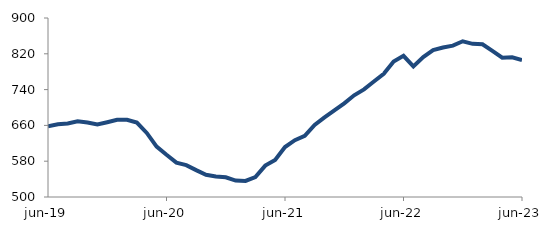
| Category | Series 0 |
|---|---|
| 2019-06-01 | 657.952 |
| 2019-07-01 | 662.49 |
| 2019-08-01 | 664.104 |
| 2019-09-01 | 669.196 |
| 2019-10-01 | 666.5 |
| 2019-11-01 | 662.174 |
| 2019-12-01 | 667.143 |
| 2020-01-01 | 672.455 |
| 2020-02-01 | 672.659 |
| 2020-03-01 | 666.213 |
| 2020-04-01 | 643.145 |
| 2020-05-01 | 612.572 |
| 2020-06-01 | 594.292 |
| 2020-07-01 | 576.858 |
| 2020-08-01 | 571.224 |
| 2020-09-01 | 560.032 |
| 2020-10-01 | 549.541 |
| 2020-11-01 | 545.982 |
| 2020-12-01 | 544.038 |
| 2021-01-01 | 536.772 |
| 2021-02-01 | 535.938 |
| 2021-03-01 | 544.717 |
| 2021-04-01 | 570.16 |
| 2021-05-01 | 582.981 |
| 2021-06-01 | 611.684 |
| 2021-07-01 | 627.037 |
| 2021-08-01 | 636.642 |
| 2021-09-01 | 661.114 |
| 2021-10-01 | 677.889 |
| 2021-11-01 | 693.389 |
| 2021-12-01 | 709.343 |
| 2022-01-01 | 727.31 |
| 2022-02-01 | 740.539 |
| 2022-03-01 | 758.027 |
| 2022-04-01 | 775.241 |
| 2022-05-01 | 802.956 |
| 2022-06-01 | 815.434 |
| 2022-07-01 | 791.89 |
| 2022-08-01 | 812.76 |
| 2022-09-01 | 828.12 |
| 2022-10-01 | 834 |
| 2022-11-01 | 838.178 |
| 2022-12-01 | 847.954 |
| 2023-01-01 | 842.285 |
| 2023-02-01 | 841.25 |
| 2023-03-01 | 826.38 |
| 2023-04-01 | 811.394 |
| 2023-05-01 | 812.228 |
| 2023-06-01 | 805.926 |